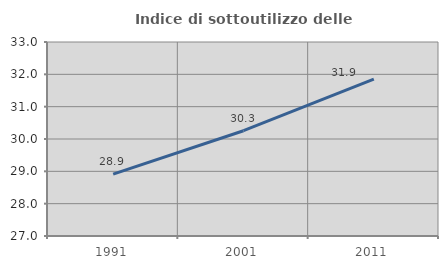
| Category | Indice di sottoutilizzo delle abitazioni  |
|---|---|
| 1991.0 | 28.912 |
| 2001.0 | 30.256 |
| 2011.0 | 31.851 |